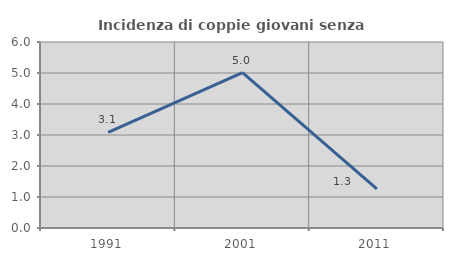
| Category | Incidenza di coppie giovani senza figli |
|---|---|
| 1991.0 | 3.081 |
| 2001.0 | 5.012 |
| 2011.0 | 1.263 |